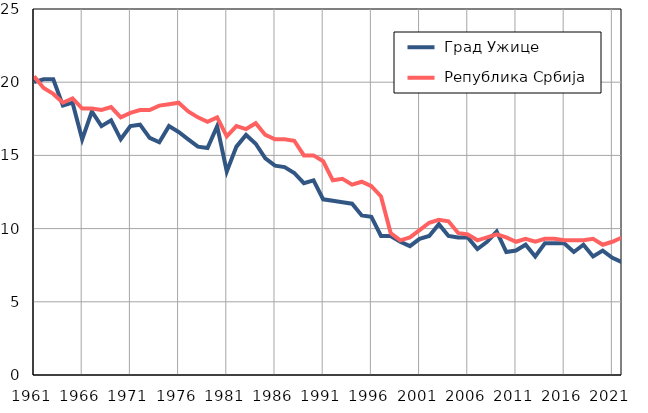
| Category |  Град Ужице |  Република Србија |
|---|---|---|
| 1961.0 | 20 | 20.4 |
| 1962.0 | 20.2 | 19.6 |
| 1963.0 | 20.2 | 19.2 |
| 1964.0 | 18.4 | 18.6 |
| 1965.0 | 18.6 | 18.9 |
| 1966.0 | 16.1 | 18.2 |
| 1967.0 | 18 | 18.2 |
| 1968.0 | 17 | 18.1 |
| 1969.0 | 17.4 | 18.3 |
| 1970.0 | 16.1 | 17.6 |
| 1971.0 | 17 | 17.9 |
| 1972.0 | 17.1 | 18.1 |
| 1973.0 | 16.2 | 18.1 |
| 1974.0 | 15.9 | 18.4 |
| 1975.0 | 17 | 18.5 |
| 1976.0 | 16.6 | 18.6 |
| 1977.0 | 16.1 | 18 |
| 1978.0 | 15.6 | 17.6 |
| 1979.0 | 15.5 | 17.3 |
| 1980.0 | 17 | 17.6 |
| 1981.0 | 13.9 | 16.3 |
| 1982.0 | 15.6 | 17 |
| 1983.0 | 16.4 | 16.8 |
| 1984.0 | 15.8 | 17.2 |
| 1985.0 | 14.8 | 16.4 |
| 1986.0 | 14.3 | 16.1 |
| 1987.0 | 14.2 | 16.1 |
| 1988.0 | 13.8 | 16 |
| 1989.0 | 13.1 | 15 |
| 1990.0 | 13.3 | 15 |
| 1991.0 | 12 | 14.6 |
| 1992.0 | 11.9 | 13.3 |
| 1993.0 | 11.8 | 13.4 |
| 1994.0 | 11.7 | 13 |
| 1995.0 | 10.9 | 13.2 |
| 1996.0 | 10.8 | 12.9 |
| 1997.0 | 9.5 | 12.2 |
| 1998.0 | 9.5 | 9.7 |
| 1999.0 | 9.1 | 9.2 |
| 2000.0 | 8.8 | 9.4 |
| 2001.0 | 9.3 | 9.9 |
| 2002.0 | 9.5 | 10.4 |
| 2003.0 | 10.3 | 10.6 |
| 2004.0 | 9.5 | 10.5 |
| 2005.0 | 9.4 | 9.7 |
| 2006.0 | 9.4 | 9.6 |
| 2007.0 | 8.6 | 9.2 |
| 2008.0 | 9.1 | 9.4 |
| 2009.0 | 9.8 | 9.6 |
| 2010.0 | 8.4 | 9.4 |
| 2011.0 | 8.5 | 9.1 |
| 2012.0 | 8.9 | 9.3 |
| 2013.0 | 8.1 | 9.1 |
| 2014.0 | 9 | 9.3 |
| 2015.0 | 9 | 9.3 |
| 2016.0 | 9 | 9.2 |
| 2017.0 | 8.4 | 9.2 |
| 2018.0 | 8.9 | 9.2 |
| 2019.0 | 8.1 | 9.3 |
| 2020.0 | 8.5 | 8.9 |
| 2021.0 | 8 | 9.1 |
| 2022.0 | 7.7 | 9.4 |